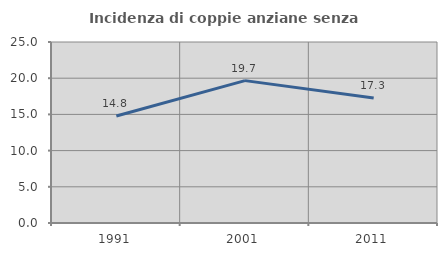
| Category | Incidenza di coppie anziane senza figli  |
|---|---|
| 1991.0 | 14.783 |
| 2001.0 | 19.665 |
| 2011.0 | 17.269 |